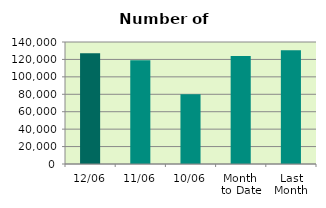
| Category | Series 0 |
|---|---|
| 12/06 | 127054 |
| 11/06 | 118936 |
| 10/06 | 80084 |
| Month 
to Date | 123867.75 |
| Last
Month | 130647.636 |